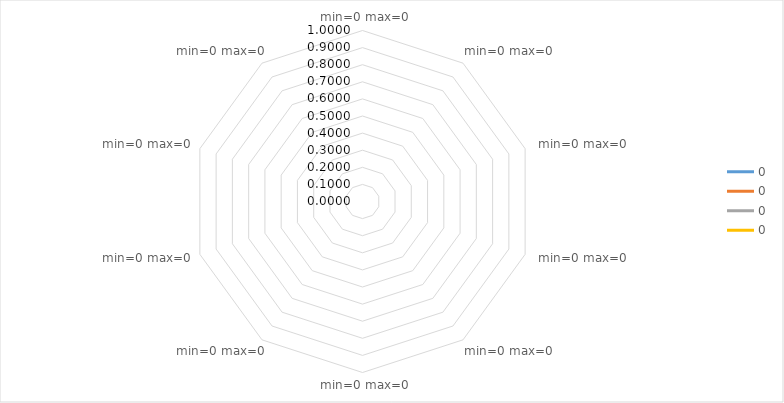
| Category | 0 |
|---|---|
|   min=0 max=0 | 0 |
|   min=0 max=0 | 0 |
|   min=0 max=0 | 0 |
|   min=0 max=0 | 0 |
|   min=0 max=0 | 0 |
|   min=0 max=0 | 0 |
|   min=0 max=0 | 0 |
|   min=0 max=0 | 0 |
|   min=0 max=0 | 0 |
|   min=0 max=0 | 0 |